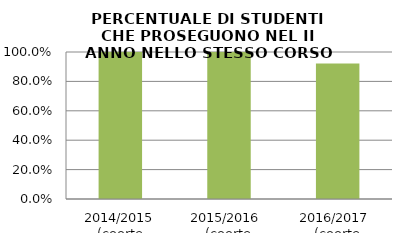
| Category | 2014/2015 (coorte 2013/14) 2015/2016  (coorte 2014/15) 2016/2017  (coorte 2015/16) |
|---|---|
| 2014/2015 (coorte 2013/14) | 1 |
| 2015/2016  (coorte 2014/15) | 1 |
| 2016/2017  (coorte 2015/16) | 0.922 |